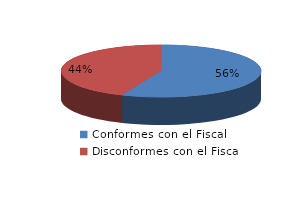
| Category | Series 0 |
|---|---|
| 0 | 980 |
| 1 | 759 |